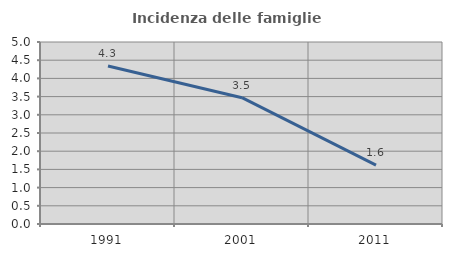
| Category | Incidenza delle famiglie numerose |
|---|---|
| 1991.0 | 4.338 |
| 2001.0 | 3.471 |
| 2011.0 | 1.618 |